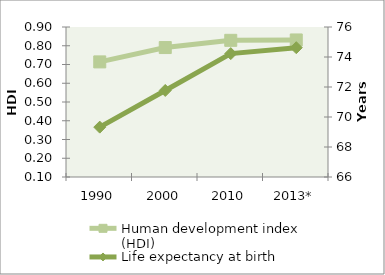
| Category | Human development index (HDI) |
|---|---|
| 1990 | 0.714 |
| 2000 | 0.79 |
| 2010 | 0.829 |
| 2013* | 0.831 |